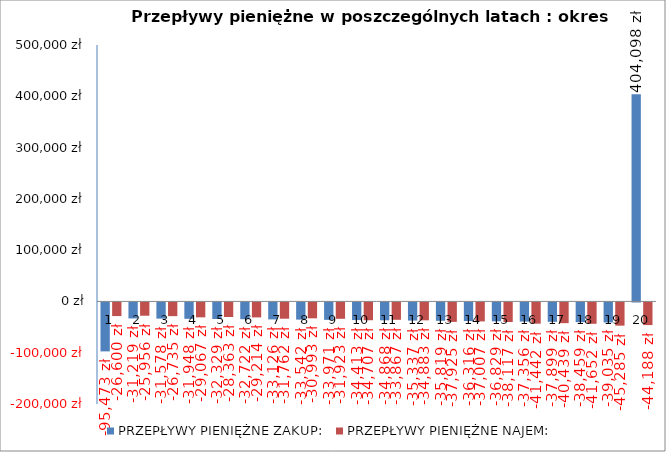
| Category | PRZEPŁYWY PIENIĘŻNE ZAKUP: | PRZEPŁYWY PIENIĘŻNE NAJEM: |
|---|---|---|
| 0 | -95472.749 | -26600 |
| 1 | -31218.969 | -25956 |
| 2 | -31578.15 | -26734.68 |
| 3 | -31948.107 | -29066.538 |
| 4 | -32329.163 | -28362.822 |
| 5 | -32721.651 | -29213.707 |
| 6 | -33125.913 | -31761.791 |
| 7 | -33542.303 | -30992.821 |
| 8 | -33971.184 | -31922.606 |
| 9 | -34412.932 | -34706.967 |
| 10 | -34867.933 | -33866.693 |
| 11 | -35336.583 | -34882.694 |
| 12 | -35819.293 | -37925.24 |
| 13 | -36316.485 | -37007.05 |
| 14 | -36828.592 | -38117.261 |
| 15 | -37356.062 | -41441.933 |
| 16 | -37899.356 | -40438.602 |
| 17 | -38458.95 | -41651.76 |
| 18 | -39035.331 | -45284.719 |
| 19 | 404097.562 | -44188.353 |